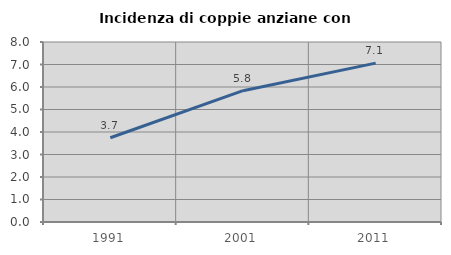
| Category | Incidenza di coppie anziane con figli |
|---|---|
| 1991.0 | 3.745 |
| 2001.0 | 5.837 |
| 2011.0 | 7.061 |